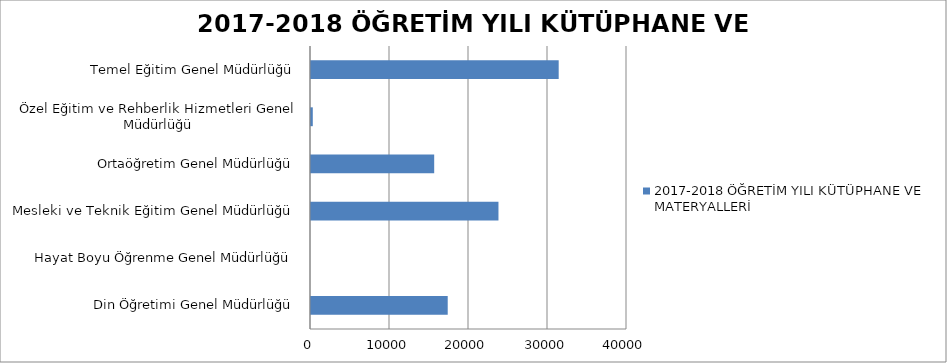
| Category | 2017-2018 ÖĞRETİM YILI KÜTÜPHANE VE MATERYALLERİ |
|---|---|
| Din Öğretimi Genel Müdürlüğü | 17306 |
| Hayat Boyu Öğrenme Genel Müdürlüğü | 0 |
| Mesleki ve Teknik Eğitim Genel Müdürlüğü | 23730 |
| Ortaöğretim Genel Müdürlüğü | 15594 |
| Özel Eğitim ve Rehberlik Hizmetleri Genel Müdürlüğü | 226 |
| Temel Eğitim Genel Müdürlüğü | 31353 |